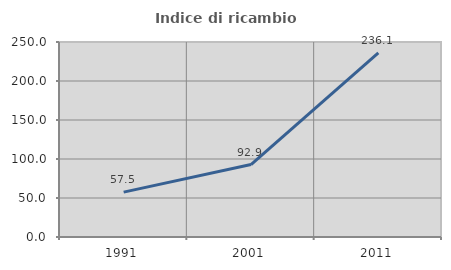
| Category | Indice di ricambio occupazionale  |
|---|---|
| 1991.0 | 57.5 |
| 2001.0 | 92.903 |
| 2011.0 | 236.111 |